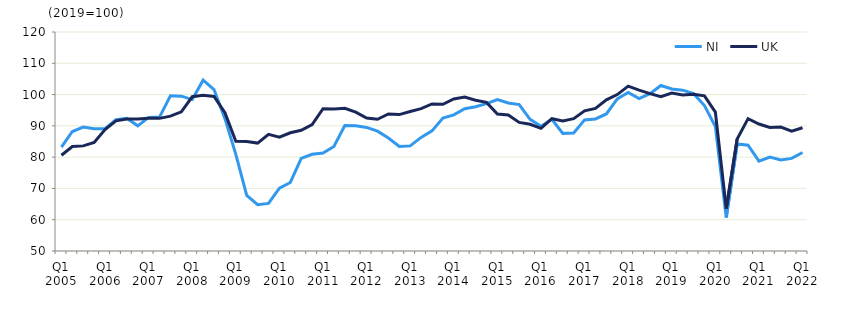
| Category | NI | UK  |
|---|---|---|
| Q1 2005 | 83.2 | 80.6 |
|  | 88.2 | 83.4 |
| Q3 2005 | 89.6 | 83.6 |
|  | 89.1 | 84.7 |
| Q1 2006 | 89.1 | 88.8 |
|  | 92 | 91.6 |
| Q3 2006 | 92.4 | 92.2 |
|  | 90 | 92.2 |
| Q1 2007 | 92.7 | 92.4 |
|  | 92.8 | 92.4 |
| Q3 2007 | 99.6 | 93.1 |
|  | 99.5 | 94.5 |
| Q1 2008 | 98.4 | 99.3 |
|  | 104.6 | 99.8 |
| Q3 2008 | 101.6 | 99.4 |
|  | 92.3 | 94.2 |
| Q1 2009 | 80.9 | 85.1 |
|  | 67.8 | 85 |
| Q3 2009 | 64.8 | 84.5 |
|  | 65.2 | 87.3 |
| Q1 2010 | 70.1 | 86.4 |
|  | 71.9 | 87.8 |
| Q3 2010 | 79.6 | 88.6 |
|  | 80.9 | 90.4 |
| Q1 2011 | 81.3 | 95.5 |
|  | 83.4 | 95.4 |
| Q3 2011 | 90.1 | 95.6 |
|  | 90 | 94.4 |
| Q1 2012 | 89.5 | 92.5 |
|  | 88.3 | 92.1 |
| Q3 2012 | 86.1 | 93.8 |
|  | 83.4 | 93.6 |
| Q1 2013 | 83.6 | 94.6 |
|  | 86.3 | 95.5 |
| Q3 2013 | 88.4 | 97 |
|  | 92.5 | 96.9 |
| Q1 2014 | 93.5 | 98.6 |
|  | 95.5 | 99.2 |
| Q3 2014 | 96.1 | 98.2 |
|  | 97.1 | 97.5 |
| Q1 2015 | 98.4 | 93.8 |
|  | 97.3 | 93.5 |
| Q3 2015 | 96.8 | 91.1 |
|  | 92.1 | 90.5 |
| Q1 2016 | 89.9 | 89.2 |
|  | 92.1 | 92.3 |
| Q3 2016 | 87.6 | 91.6 |
|  | 87.7 | 92.3 |
| Q1 2017 | 91.9 | 94.8 |
|  | 92.2 | 95.6 |
| Q3 2017 | 93.8 | 98.3 |
|  | 98.6 | 100 |
| Q1 2018 | 100.7 | 102.7 |
|  | 98.7 | 101.4 |
| Q3 2018 | 100.3 | 100.3 |
|  | 102.9 | 99.3 |
| Q1 2019 | 101.8 | 100.5 |
|  | 101.4 | 99.9 |
| Q3 2019 | 100.3 | 100.1 |
|  | 96.5 | 99.6 |
| Q1 2020 | 89.8 | 94.4 |
|  | 60.7 | 63.5 |
| Q3 2020 | 84.2 | 85.8 |
|  | 83.8 | 92.3 |
| Q1 2021 | 78.7 | 90.6 |
|  | 80 | 89.5 |
| Q3 2021 | 79.1 | 89.6 |
|  | 79.6 | 88.3 |
| Q1 2022 | 81.5 | 89.4 |